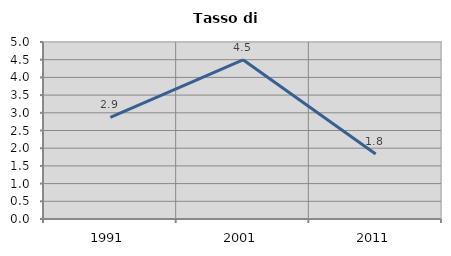
| Category | Tasso di disoccupazione   |
|---|---|
| 1991.0 | 2.874 |
| 2001.0 | 4.498 |
| 2011.0 | 1.838 |